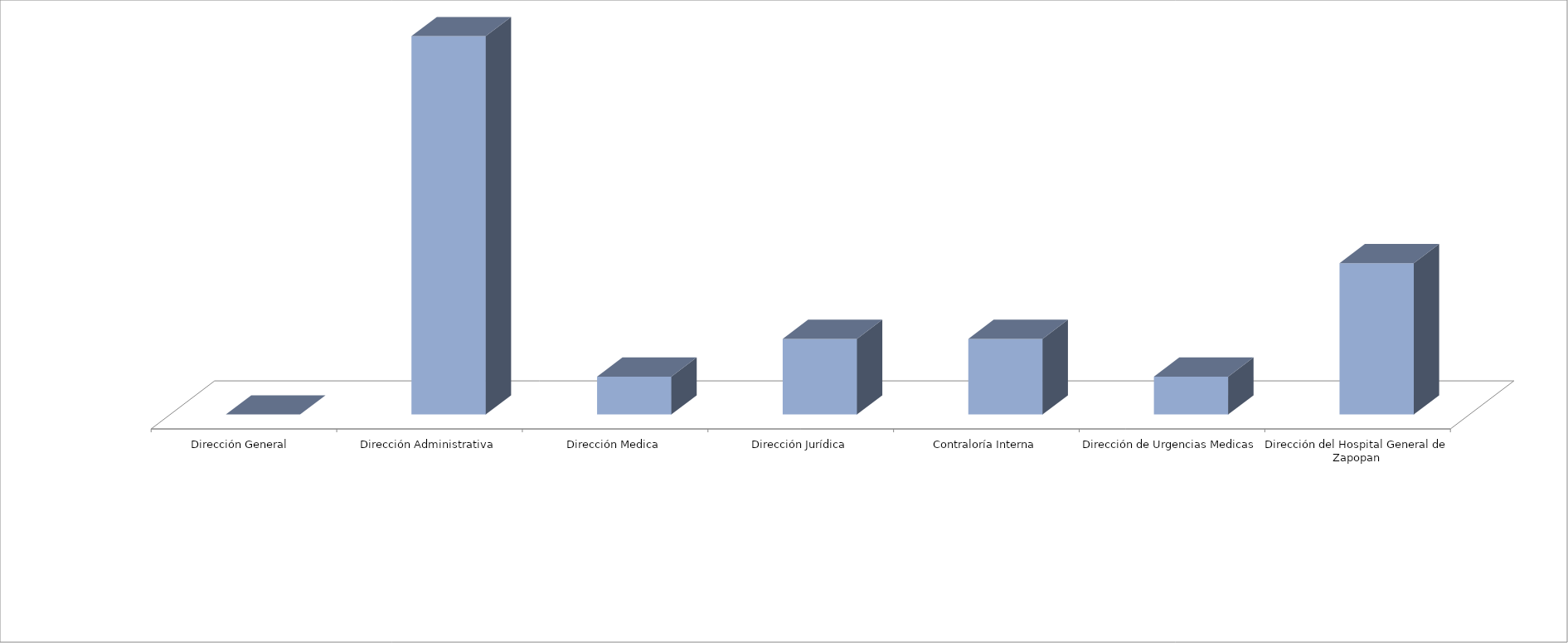
| Category | Series 0 | Series 1 |
|---|---|---|
| Dirección General  |  | 0 |
| Dirección Administrativa |  | 10 |
| Dirección Medica |  | 1 |
| Dirección Jurídica |  | 2 |
| Contraloría Interna |  | 2 |
| Dirección de Urgencias Medicas |  | 1 |
| Dirección del Hospital General de Zapopan |  | 4 |